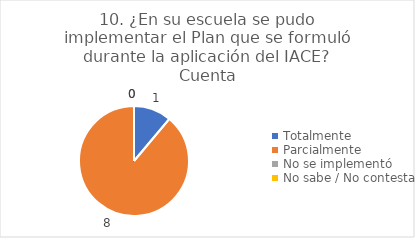
| Category | 10. ¿En su escuela se pudo implementar el Plan que se formuló durante la aplicación del IACE? |
|---|---|
| Totalmente  | 0.111 |
| Parcialmente  | 0.889 |
| No se implementó  | 0 |
| No sabe / No contesta | 0 |